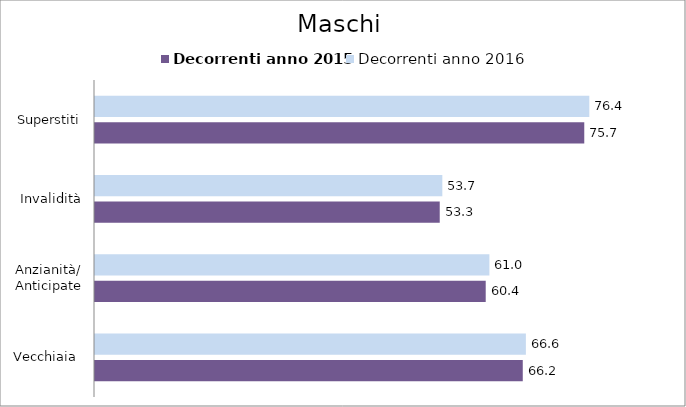
| Category | Decorrenti anno 2015 | Decorrenti anno 2016 |
|---|---|---|
| Vecchiaia  | 66.15 | 66.63 |
| Anzianità/ Anticipate | 60.42 | 60.99 |
| Invalidità | 53.31 | 53.71 |
| Superstiti | 75.66 | 76.44 |